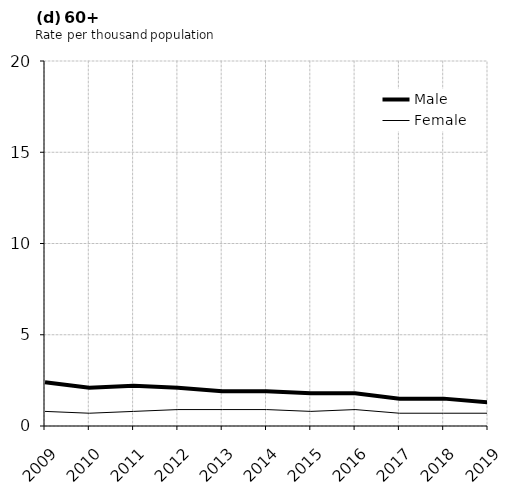
| Category | Male | Female |
|---|---|---|
| 2009.0 | 2.4 | 0.8 |
| 2010.0 | 2.1 | 0.7 |
| 2011.0 | 2.2 | 0.8 |
| 2012.0 | 2.1 | 0.9 |
| 2013.0 | 1.9 | 0.9 |
| 2014.0 | 1.9 | 0.9 |
| 2015.0 | 1.8 | 0.8 |
| 2016.0 | 1.8 | 0.9 |
| 2017.0 | 1.5 | 0.7 |
| 2018.0 | 1.5 | 0.7 |
| 2019.0 | 1.3 | 0.7 |